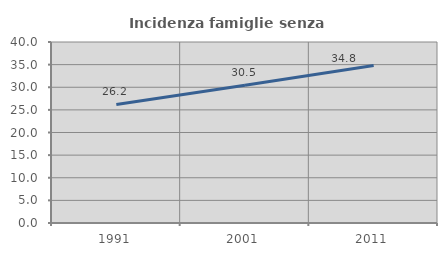
| Category | Incidenza famiglie senza nuclei |
|---|---|
| 1991.0 | 26.19 |
| 2001.0 | 30.461 |
| 2011.0 | 34.83 |